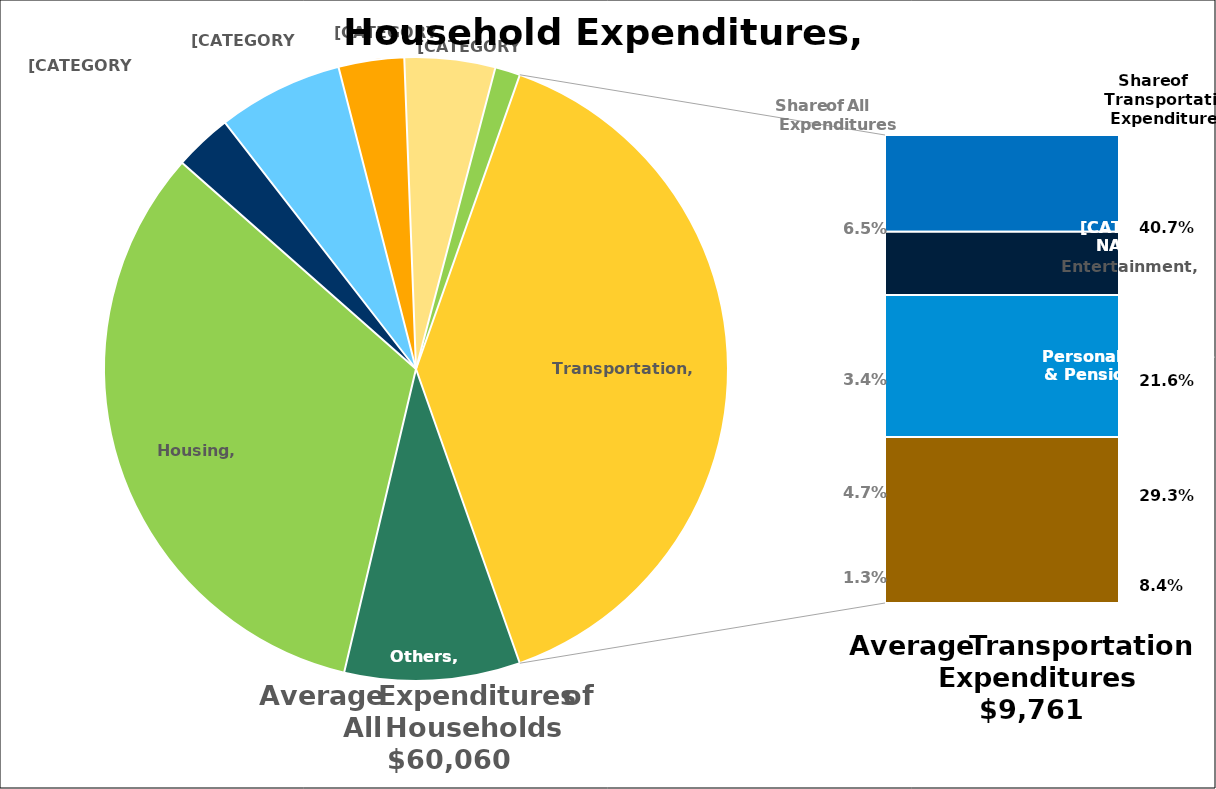
| Category | Series 0 |
|---|---|
| Others | 0.091 |
| Housing | 0.328 |
| Apparel & Services | 0.03 |
| Vehicle Purchases 
(Net Outlay) | 0.065 |
| Gasoline & Motor Oil | 0.034 |
| Other Vehicle Expenditures | 0.047 |
| Public Transportation | 0.013 |
| Health care | 0.081 |
| Entertainment | 0.053 |
| Personal Insurance & Pensions | 0.119 |
| Food | 0.139 |